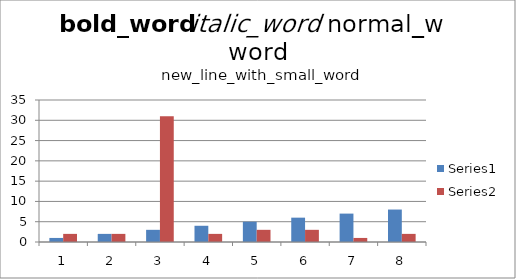
| Category | Series 0 | Series 1 |
|---|---|---|
| 0 | 1 | 2 |
| 1 | 2 | 2 |
| 2 | 3 | 31 |
| 3 | 4 | 2 |
| 4 | 5 | 3 |
| 5 | 6 | 3 |
| 6 | 7 | 1 |
| 7 | 8 | 2 |